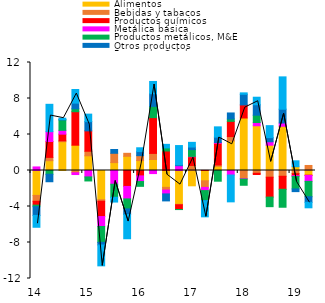
| Category | Alimentos | Bebidas y tabacos | Productos químicos | Metálica básica | Productos metálicos, M&E | Otros productos | Forestal y Celulosa |
|---|---|---|---|---|---|---|---|
| 0 | -2.767 | -0.653 | -0.428 | 0.395 | -0.17 | -0.972 | -1.317 |
| 1 | 1.092 | 0.365 | 1.768 | 1.092 | -0.419 | -0.83 | 3.038 |
| 2 | 3.198 | 0.103 | 0.74 | 0.423 | 1.158 | 0.028 | 0.164 |
| 3 | 2.811 | -0.252 | 3.721 | -0.197 | 0.327 | 0.627 | 1.513 |
| 4 | 1.631 | 0.508 | 2.264 | -0.713 | -0.449 | 1.027 | 0.833 |
| 5 | -3.254 | -0.161 | -1.701 | -1.109 | -1.759 | -0.294 | -2.318 |
| 6 | 0.878 | 1.035 | -0.002 | -1.525 | -1.449 | 0.421 | -0.531 |
| 7 | 1.578 | 0.331 | -1.771 | -1.386 | -1.11 | -0.624 | -2.692 |
| 8 | 1.101 | 0.546 | -0.599 | -0.629 | -0.531 | 0.456 | 0.421 |
| 9 | 1.223 | 0.674 | 3.977 | -0.343 | 1.247 | 1.411 | 1.36 |
| 10 | -1.872 | -0.301 | 2.166 | -0.429 | 0.343 | -0.776 | 0.397 |
| 11 | -3.754 | -0.054 | -0.527 | 0.536 | -0.005 | 0.093 | 2.142 |
| 12 | -1.7 | 0.56 | 0.969 | 0.039 | 0.752 | 0.288 | 0.521 |
| 13 | -1.15 | -0.73 | 0.01 | -0.351 | -1.128 | -0.005 | -1.785 |
| 14 | 0.464 | 0.151 | 2.416 | 0.081 | -1.19 | 0.597 | 1.14 |
| 15 | 3.278 | 0.492 | 1.689 | -0.501 | 0.263 | 0.67 | -2.982 |
| 16 | 5.835 | -0.908 | 1.452 | -0.046 | -0.687 | 1.182 | 0.158 |
| 17 | 4.972 | -0.308 | -0.136 | 0.359 | 0.815 | 1.163 | 0.834 |
| 18 | 2.808 | -0.745 | -2.211 | 0.386 | -1.064 | 0.458 | 1.331 |
| 19 | 4.916 | -0.641 | -1.446 | 0.361 | -1.995 | 1.534 | 3.592 |
| 20 | 0.422 | -0.35 | -0.227 | -0.093 | -1.377 | -0.301 | 0.654 |
| 21 | -0.521 | 0.56 | -0.026 | -0.665 | -1.701 | -0.624 | -0.608 |